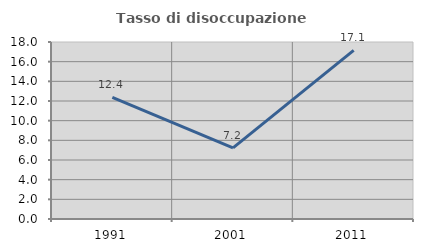
| Category | Tasso di disoccupazione giovanile  |
|---|---|
| 1991.0 | 12.371 |
| 2001.0 | 7.234 |
| 2011.0 | 17.143 |